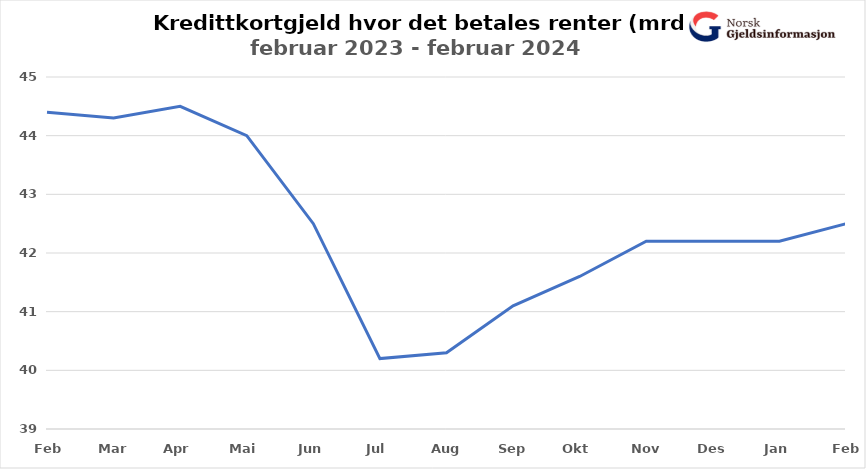
| Category | Rentebærende rammekreditt |
|---|---|
| Feb | 44.4 |
| Mar | 44.3 |
| Apr | 44.5 |
| Mai | 44 |
| Jun | 42.5 |
| Jul | 40.2 |
| Aug | 40.3 |
| Sep | 41.1 |
| Okt | 41.6 |
| Nov | 42.2 |
| Des | 42.2 |
| Jan | 42.2 |
| Feb | 42.5 |